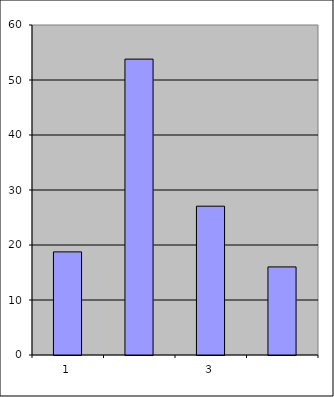
| Category | Series 0 |
|---|---|
| 0 | 18.75 |
| 1 | 53.796 |
| 2 | 27.054 |
| 3 | 16.015 |